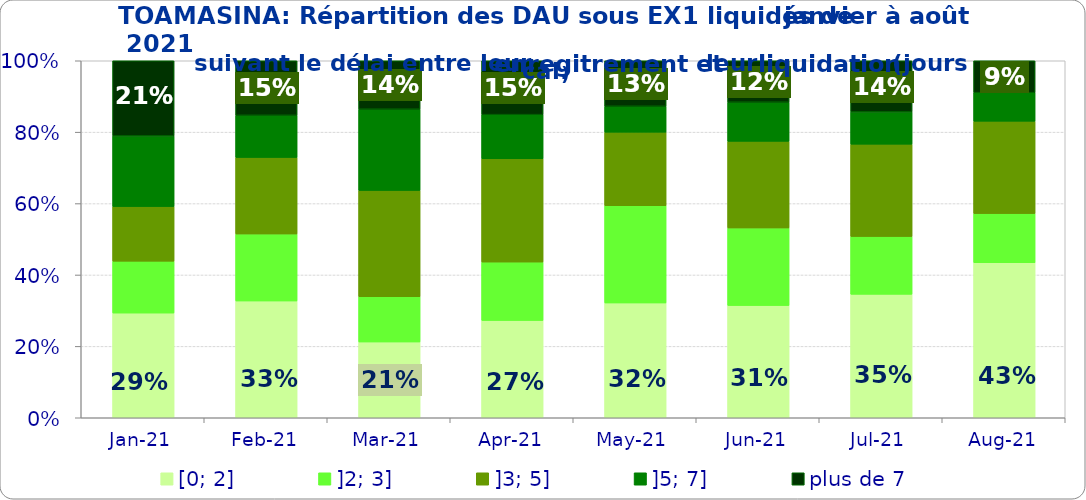
| Category | [0; 2] | ]2; 3] | ]3; 5] | ]5; 7] | plus de 7 |
|---|---|---|---|---|---|
| 2021-01-01 | 0.293 | 0.145 | 0.153 | 0.198 | 0.211 |
| 2021-02-01 | 0.327 | 0.188 | 0.214 | 0.118 | 0.153 |
| 2021-03-01 | 0.212 | 0.127 | 0.298 | 0.228 | 0.136 |
| 2021-04-01 | 0.273 | 0.164 | 0.289 | 0.124 | 0.151 |
| 2021-05-01 | 0.322 | 0.273 | 0.206 | 0.073 | 0.127 |
| 2021-06-01 | 0.314 | 0.217 | 0.243 | 0.11 | 0.116 |
| 2021-07-01 | 0.346 | 0.162 | 0.259 | 0.09 | 0.143 |
| 2021-08-01 | 0.435 | 0.137 | 0.259 | 0.08 | 0.089 |